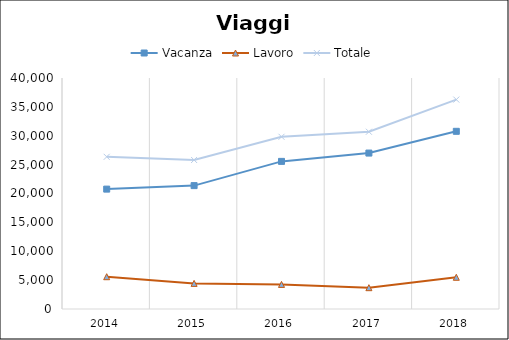
| Category | Vacanza | Lavoro | Totale |
|---|---|---|---|
| 2014.0 | 20760 | 5592 | 26352 |
| 2015.0 | 21366 | 4437 | 25803 |
| 2016.0 | 25561 | 4258 | 29819 |
| 2017.0 | 27002 | 3692 | 30694 |
| 2018.0 | 30768 | 5495 | 36263 |